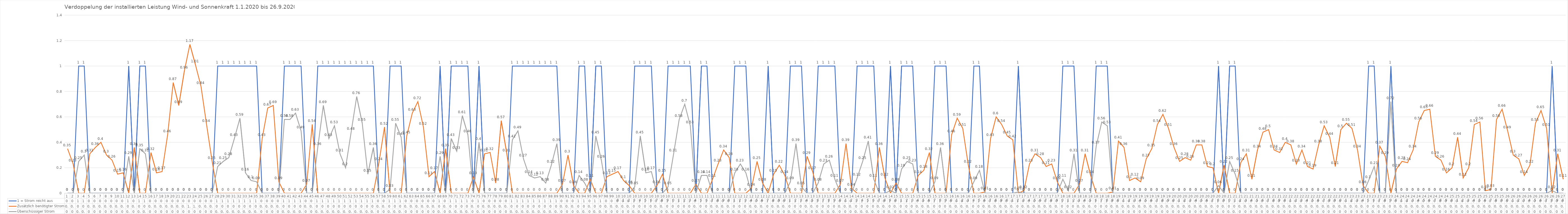
| Category | 1 = Strom reicht aus | Zusätzlich benötigter Strom | Überschüssiger Strom |
|---|---|---|---|
| 0 | 0 | 0.35 | 0 |
| 1 | 0 | 0.23 | 0 |
| 2 | 1 | 0 | 0.25 |
| 3 | 1 | 0 | 0.3 |
| 4 | 0 | 0.31 | 0 |
| 5 | 0 | 0.36 | 0 |
| 6 | 0 | 0.4 | 0 |
| 7 | 0 | 0.3 | 0 |
| 8 | 0 | 0.26 | 0 |
| 9 | 0 | 0.15 | 0 |
| 10 | 0 | 0.16 | 0 |
| 11 | 1 | 0 | 0.29 |
| 12 | 0 | 0.36 | 0 |
| 13 | 1 | 0 | 0.35 |
| 14 | 1 | 0 | 0.31 |
| 15 | 0 | 0.32 | 0 |
| 16 | 0 | 0.16 | 0 |
| 17 | 0 | 0.17 | 0 |
| 18 | 0 | 0.46 | 0 |
| 19 | 0 | 0.87 | 0 |
| 20 | 0 | 0.69 | 0 |
| 21 | 0 | 0.96 | 0 |
| 22 | 0 | 1.17 | 0 |
| 23 | 0 | 1.01 | 0 |
| 24 | 0 | 0.84 | 0 |
| 25 | 0 | 0.54 | 0 |
| 26 | 0 | 0.25 | 0 |
| 27 | 1 | 0 | 0.21 |
| 28 | 1 | 0 | 0.25 |
| 29 | 1 | 0 | 0.28 |
| 30 | 1 | 0 | 0.43 |
| 31 | 1 | 0 | 0.59 |
| 32 | 1 | 0 | 0.16 |
| 33 | 1 | 0 | 0.1 |
| 34 | 1 | 0 | 0.09 |
| 35 | 0 | 0.43 | 0 |
| 36 | 0 | 0.67 | 0 |
| 37 | 0 | 0.69 | 0 |
| 38 | 0 | 0.09 | 0 |
| 39 | 1 | 0 | 0.58 |
| 40 | 1 | 0 | 0.58 |
| 41 | 1 | 0 | 0.63 |
| 42 | 1 | 0 | 0.49 |
| 43 | 0 | 0.07 | 0 |
| 44 | 0 | 0.54 | 0 |
| 45 | 1 | 0 | 0.36 |
| 46 | 1 | 0 | 0.69 |
| 47 | 1 | 0 | 0.43 |
| 48 | 1 | 0 | 0.53 |
| 49 | 1 | 0 | 0.31 |
| 50 | 1 | 0 | 0.2 |
| 51 | 1 | 0 | 0.48 |
| 52 | 1 | 0 | 0.76 |
| 53 | 1 | 0 | 0.55 |
| 54 | 1 | 0 | 0.15 |
| 55 | 1 | 0 | 0.36 |
| 56 | 0 | 0.24 | 0 |
| 57 | 0 | 0.52 | 0 |
| 58 | 1 | 0 | 0.03 |
| 59 | 1 | 0 | 0.55 |
| 60 | 1 | 0 | 0.44 |
| 61 | 0 | 0.45 | 0 |
| 62 | 0 | 0.63 | 0 |
| 63 | 0 | 0.72 | 0 |
| 64 | 0 | 0.52 | 0 |
| 65 | 0 | 0.13 | 0 |
| 66 | 0 | 0.17 | 0 |
| 67 | 1 | 0 | 0.29 |
| 68 | 0 | 0.35 | 0 |
| 69 | 1 | 0 | 0.43 |
| 70 | 1 | 0 | 0.33 |
| 71 | 1 | 0 | 0.61 |
| 72 | 1 | 0 | 0.46 |
| 73 | 0 | 0.13 | 0 |
| 74 | 1 | 0 | 0.4 |
| 75 | 0 | 0.31 | 0 |
| 76 | 0 | 0.32 | 0 |
| 77 | 0 | 0.08 | 0 |
| 78 | 0 | 0.57 | 0 |
| 79 | 0 | 0.31 | 0 |
| 80 | 1 | 0 | 0.42 |
| 81 | 1 | 0 | 0.49 |
| 82 | 1 | 0 | 0.27 |
| 83 | 1 | 0 | 0.14 |
| 84 | 1 | 0 | 0.12 |
| 85 | 1 | 0 | 0.13 |
| 86 | 1 | 0 | 0.08 |
| 87 | 1 | 0 | 0.22 |
| 88 | 1 | 0 | 0.39 |
| 89 | 0 | 0.07 | 0 |
| 90 | 0 | 0.3 | 0 |
| 91 | 0 | 0.06 | 0 |
| 92 | 1 | 0 | 0.14 |
| 93 | 1 | 0 | 0.08 |
| 94 | 0 | 0.11 | 0 |
| 95 | 1 | 0 | 0.45 |
| 96 | 1 | 0 | 0.26 |
| 97 | 0 | 0.13 | 0 |
| 98 | 0 | 0.15 | 0 |
| 99 | 0 | 0.17 | 0 |
| 100 | 0 | 0.1 | 0 |
| 101 | 0 | 0.06 | 0 |
| 102 | 1 | 0 | 0.05 |
| 103 | 1 | 0 | 0.45 |
| 104 | 1 | 0 | 0.16 |
| 105 | 1 | 0 | 0.17 |
| 106 | 0 | 0.06 | 0 |
| 107 | 0 | 0.15 | 0 |
| 108 | 1 | 0 | 0.05 |
| 109 | 1 | 0 | 0.31 |
| 110 | 1 | 0 | 0.58 |
| 111 | 1 | 0 | 0.7 |
| 112 | 1 | 0 | 0.53 |
| 113 | 0 | 0.07 | 0 |
| 114 | 1 | 0 | 0.14 |
| 115 | 1 | 0 | 0.14 |
| 116 | 0 | 0.11 | 0 |
| 117 | 0 | 0.23 | 0 |
| 118 | 0 | 0.34 | 0 |
| 119 | 0 | 0.28 | 0 |
| 120 | 1 | 0 | 0.16 |
| 121 | 1 | 0 | 0.23 |
| 122 | 1 | 0 | 0.16 |
| 123 | 0 | 0.04 | 0 |
| 124 | 0 | 0.25 | 0 |
| 125 | 0 | 0.08 | 0 |
| 126 | 1 | 0 | 0 |
| 127 | 0 | 0.15 | 0 |
| 128 | 0 | 0.22 | 0 |
| 129 | 0 | 0.14 | 0 |
| 130 | 1 | 0 | 0.09 |
| 131 | 1 | 0 | 0.39 |
| 132 | 1 | 0 | 0.05 |
| 133 | 0 | 0.29 | 0 |
| 134 | 0 | 0.17 | 0 |
| 135 | 1 | 0 | 0.08 |
| 136 | 1 | 0 | 0.23 |
| 137 | 1 | 0 | 0.26 |
| 138 | 1 | 0 | 0.11 |
| 139 | 0 | 0.07 | 0 |
| 140 | 0 | 0.39 | 0 |
| 141 | 0 | 0.04 | 0 |
| 142 | 1 | 0 | 0.12 |
| 143 | 1 | 0 | 0.25 |
| 144 | 1 | 0 | 0.41 |
| 145 | 1 | 0 | 0.11 |
| 146 | 0 | 0.36 | 0 |
| 147 | 0 | 0.12 | 0 |
| 148 | 1 | 0 | 0.02 |
| 149 | 0 | 0.08 | 0 |
| 150 | 1 | 0 | 0.19 |
| 151 | 1 | 0 | 0.25 |
| 152 | 1 | 0 | 0.23 |
| 153 | 0 | 0.14 | 0 |
| 154 | 0 | 0.18 | 0 |
| 155 | 0 | 0.32 | 0 |
| 156 | 1 | 0 | 0.09 |
| 157 | 1 | 0 | 0.36 |
| 158 | 1 | 0 | 0 |
| 159 | 0 | 0.46 | 0 |
| 160 | 0 | 0.59 | 0 |
| 161 | 0 | 0.51 | 0 |
| 162 | 0 | 0.22 | 0 |
| 163 | 1 | 0 | 0.09 |
| 164 | 1 | 0 | 0.18 |
| 165 | 0 | 0.01 | 0 |
| 166 | 0 | 0.43 | 0 |
| 167 | 0 | 0.6 | 0 |
| 168 | 0 | 0.54 | 0 |
| 169 | 0 | 0.45 | 0 |
| 170 | 0 | 0.42 | 0 |
| 171 | 1 | 0 | 0.01 |
| 172 | 0 | 0.02 | 0 |
| 173 | 0 | 0.23 | 0 |
| 174 | 0 | 0.31 | 0 |
| 175 | 0 | 0.28 | 0 |
| 176 | 0 | 0.21 | 0 |
| 177 | 0 | 0.23 | 0 |
| 178 | 0 | 0.09 | 0 |
| 179 | 1 | 0 | 0.11 |
| 180 | 1 | 0 | 0.02 |
| 181 | 1 | 0 | 0.31 |
| 182 | 0 | 0.07 | 0 |
| 183 | 0 | 0.31 | 0 |
| 184 | 0 | 0.14 | 0 |
| 185 | 1 | 0 | 0.37 |
| 186 | 1 | 0 | 0.56 |
| 187 | 1 | 0 | 0.53 |
| 188 | 0 | 0.01 | 0 |
| 189 | 0 | 0.41 | 0 |
| 190 | 0 | 0.36 | 0 |
| 191 | 0 | 0.1 | 0 |
| 192 | 0 | 0.12 | 0 |
| 193 | 0 | 0.09 | 0 |
| 194 | 0 | 0.27 | 0 |
| 195 | 0 | 0.35 | 0 |
| 196 | 0 | 0.54 | 0 |
| 197 | 0 | 0.62 | 0 |
| 198 | 0 | 0.51 | 0 |
| 199 | 0 | 0.36 | 0 |
| 200 | 0 | 0.25 | 0 |
| 201 | 0 | 0.28 | 0 |
| 202 | 0 | 0.26 | 0 |
| 203 | 0 | 0.38 | 0 |
| 204 | 0 | 0.38 | 0 |
| 205 | 0 | 0.21 | 0 |
| 206 | 0 | 0.2 | 0 |
| 207 | 1 | 0 | 0.06 |
| 208 | 0 | 0.22 | 0 |
| 209 | 1 | 0 | 0.25 |
| 210 | 1 | 0 | 0.15 |
| 211 | 0 | 0.24 | 0 |
| 212 | 0 | 0.31 | 0 |
| 213 | 0 | 0.11 | 0 |
| 214 | 0 | 0.34 | 0 |
| 215 | 0 | 0.48 | 0 |
| 216 | 0 | 0.5 | 0 |
| 217 | 0 | 0.34 | 0 |
| 218 | 0 | 0.32 | 0 |
| 219 | 0 | 0.4 | 0 |
| 220 | 0 | 0.38 | 0 |
| 221 | 0 | 0.23 | 0 |
| 222 | 0 | 0.34 | 0 |
| 223 | 0 | 0.21 | 0 |
| 224 | 0 | 0.19 | 0 |
| 225 | 0 | 0.38 | 0 |
| 226 | 0 | 0.53 | 0 |
| 227 | 0 | 0.44 | 0 |
| 228 | 0 | 0.21 | 0 |
| 229 | 0 | 0.5 | 0 |
| 230 | 0 | 0.55 | 0 |
| 231 | 0 | 0.51 | 0 |
| 232 | 0 | 0.34 | 0 |
| 233 | 0 | 0.06 | 0 |
| 234 | 1 | 0 | 0.1 |
| 235 | 1 | 0 | 0.21 |
| 236 | 0 | 0.37 | 0 |
| 237 | 0 | 0.29 | 0 |
| 238 | 1 | 0 | 0.72 |
| 239 | 0 | 0.19 | 0 |
| 240 | 0 | 0.25 | 0 |
| 241 | 0 | 0.24 | 0 |
| 242 | 0 | 0.34 | 0 |
| 243 | 0 | 0.56 | 0 |
| 244 | 0 | 0.65 | 0 |
| 245 | 0 | 0.66 | 0 |
| 246 | 0 | 0.29 | 0 |
| 247 | 0 | 0.26 | 0 |
| 248 | 0 | 0.16 | 0 |
| 249 | 0 | 0.2 | 0 |
| 250 | 0 | 0.44 | 0 |
| 251 | 0 | 0.12 | 0 |
| 252 | 0 | 0.2 | 0 |
| 253 | 0 | 0.54 | 0 |
| 254 | 0 | 0.56 | 0 |
| 255 | 0 | 0.02 | 0 |
| 256 | 0 | 0.03 | 0 |
| 257 | 0 | 0.58 | 0 |
| 258 | 0 | 0.66 | 0 |
| 259 | 0 | 0.49 | 0 |
| 260 | 0 | 0.3 | 0 |
| 261 | 0 | 0.27 | 0 |
| 262 | 0 | 0.14 | 0 |
| 263 | 0 | 0.22 | 0 |
| 264 | 0 | 0.55 | 0 |
| 265 | 0 | 0.65 | 0 |
| 266 | 0 | 0.51 | 0 |
| 267 | 1 | 0 | 0.02 |
| 268 | 0 | 0.31 | 0 |
| 269 | 0 | 0.11 | 0 |